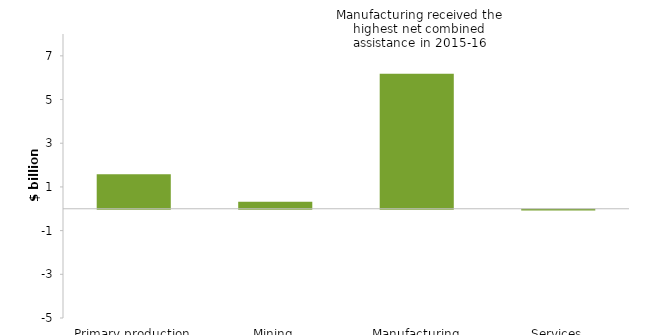
| Category | Net combined assistance |
|---|---|
| Primary production | 1.578 |
| Mining | 0.319 |
| Manufacturing | 6.176 |
| Services | -0.034 |